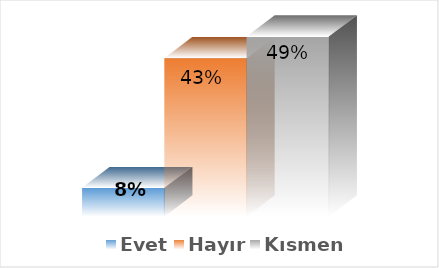
| Category | Evet | Hayır | Kısmen |
|---|---|---|---|
| 0 | 0.078 | 0.431 | 0.49 |